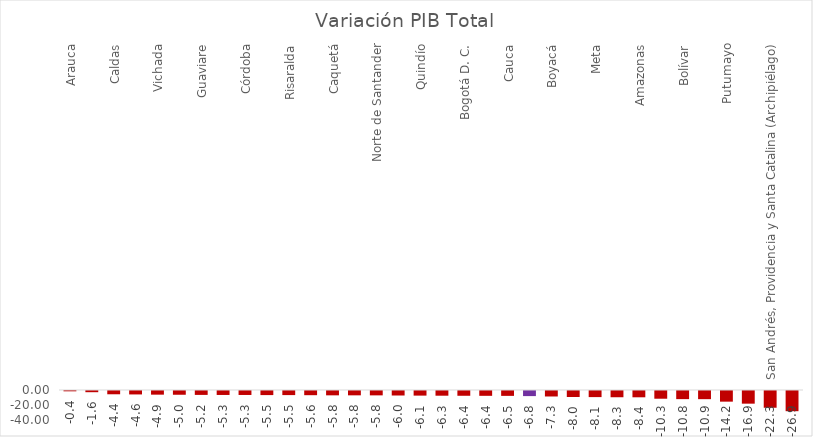
| Category | Variación PIB Total |
|---|---|
| Arauca | -0.423 |
| Chocó | -1.601 |
| Caldas | -4.366 |
| Nariño | -4.584 |
| Vichada | -4.875 |
| Huila | -5 |
| Guaviare | -5.204 |
| Valle del Cauca | -5.283 |
| Córdoba | -5.294 |
| Antioquia | -5.454 |
| Risaralda | -5.462 |
| Cundinamarca | -5.58 |
| Caquetá | -5.777 |
| Atlántico | -5.781 |
| Norte de Santander | -5.817 |
| Sucre | -6 |
| Quindío | -6.148 |
| Magdalena | -6.266 |
| Bogotá D. C. | -6.365 |
| Tolima | -6.428 |
| Cauca | -6.49 |
| COLOMBIA | -6.796 |
| Boyacá | -7.315 |
| Vaupés | -8.04 |
| Meta | -8.138 |
| Santander | -8.324 |
| Amazonas | -8.395 |
| Casanare | -10.296 |
| Bolívar | -10.838 |
| Guainía | -10.888 |
| Putumayo | -14.204 |
| Cesar | -16.874 |
| San Andrés, Providencia y Santa Catalina (Archipiélago) | -22.324 |
| La Guajira | -26.916 |